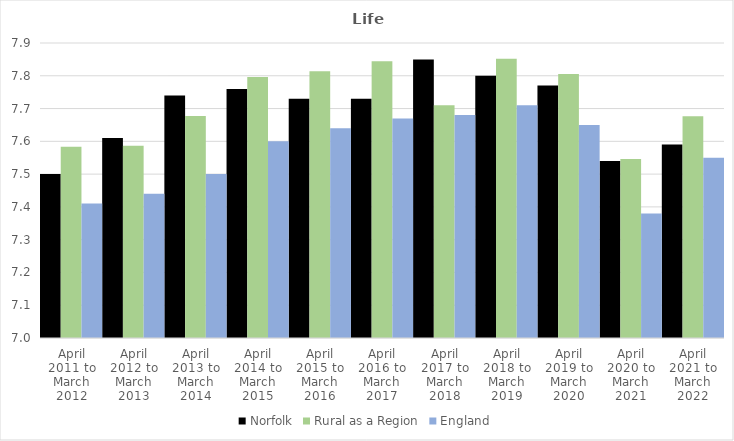
| Category | Norfolk | Rural as a Region | England |
|---|---|---|---|
| April 2011 to March 2012 | 7.5 | 7.584 | 7.41 |
| April 2012 to March 2013 | 7.61 | 7.586 | 7.44 |
| April 2013 to March 2014 | 7.74 | 7.677 | 7.5 |
| April 2014 to March 2015 | 7.76 | 7.797 | 7.6 |
| April 2015 to March 2016 | 7.73 | 7.813 | 7.64 |
| April 2016 to March 2017 | 7.73 | 7.845 | 7.67 |
| April 2017 to March 2018 | 7.85 | 7.71 | 7.68 |
| April 2018 to March 2019 | 7.8 | 7.852 | 7.71 |
| April 2019 to March 2020 | 7.77 | 7.806 | 7.65 |
| April 2020 to March 2021 | 7.54 | 7.546 | 7.38 |
| April 2021 to March 2022 | 7.59 | 7.677 | 7.55 |